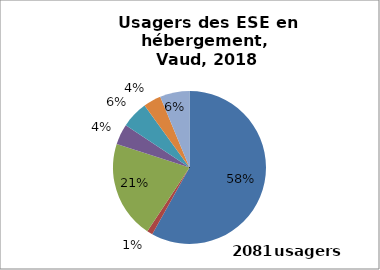
| Category | HEB |
|---|---|
| déficience intellectuelle | 1209 |
| troubles psychiques | 25 |
| addiction | 430 |
| autre/hors périmètre | 91 |
| déficience physique | 118 |
| déficience sensorielle | 78 |
| polyhandicap | 130 |
| non indiqué | 0 |